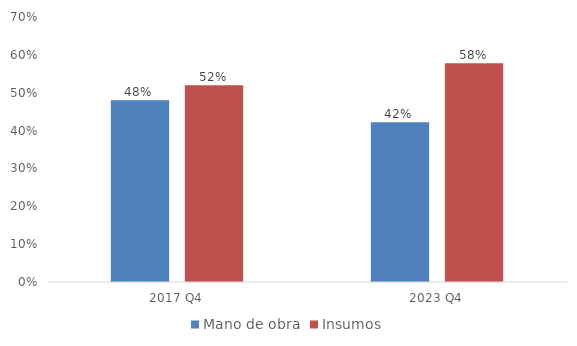
| Category | Mano de obra | Insumos |
|---|---|---|
| 2017 Q4 | 0.48 | 0.52 |
| 2023 Q4 | 0.422 | 0.578 |